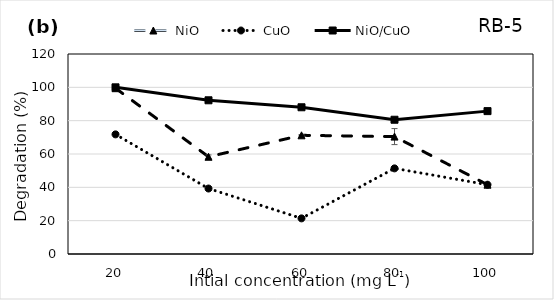
| Category | NiO  | CuO  | NiO/CuO  |
|---|---|---|---|
| 20.0 | 99.487 | 71.783 | 100 |
| 40.0 | 58.347 | 39.29 | 92.231 |
| 60.0 | 71.214 | 21.38 | 88.039 |
| 80.0 | 70.446 | 51.383 | 80.556 |
| 100.0 | 41.58 | 41.58 | 85.729 |